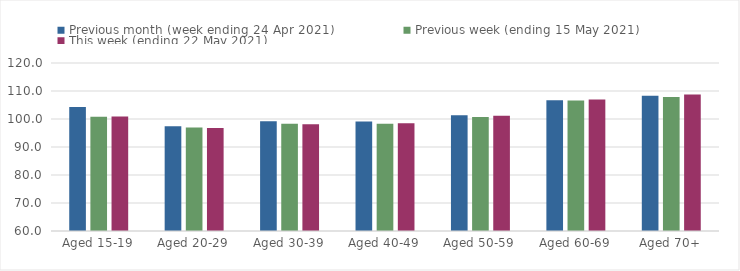
| Category | Previous month (week ending 24 Apr 2021) | Previous week (ending 15 May 2021) | This week (ending 22 May 2021) |
|---|---|---|---|
| Aged 15-19 | 104.29 | 100.77 | 100.91 |
| Aged 20-29 | 97.43 | 96.98 | 96.81 |
| Aged 30-39 | 99.16 | 98.26 | 98.16 |
| Aged 40-49 | 99.1 | 98.26 | 98.52 |
| Aged 50-59 | 101.32 | 100.72 | 101.12 |
| Aged 60-69 | 106.73 | 106.58 | 106.98 |
| Aged 70+ | 108.27 | 107.85 | 108.75 |